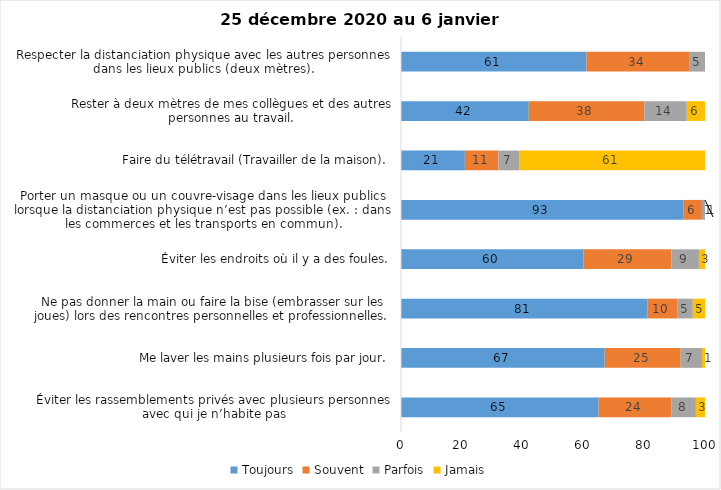
| Category | Toujours | Souvent | Parfois | Jamais |
|---|---|---|---|---|
| Éviter les rassemblements privés avec plusieurs personnes avec qui je n’habite pas | 65 | 24 | 8 | 3 |
| Me laver les mains plusieurs fois par jour. | 67 | 25 | 7 | 1 |
| Ne pas donner la main ou faire la bise (embrasser sur les joues) lors des rencontres personnelles et professionnelles. | 81 | 10 | 5 | 5 |
| Éviter les endroits où il y a des foules. | 60 | 29 | 9 | 3 |
| Porter un masque ou un couvre-visage dans les lieux publics lorsque la distanciation physique n’est pas possible (ex. : dans les commerces et les transports en commun). | 93 | 6 | 1 | 1 |
| Faire du télétravail (Travailler de la maison). | 21 | 11 | 7 | 61 |
| Rester à deux mètres de mes collègues et des autres personnes au travail. | 42 | 38 | 14 | 6 |
| Respecter la distanciation physique avec les autres personnes dans les lieux publics (deux mètres). | 61 | 34 | 5 | 0 |